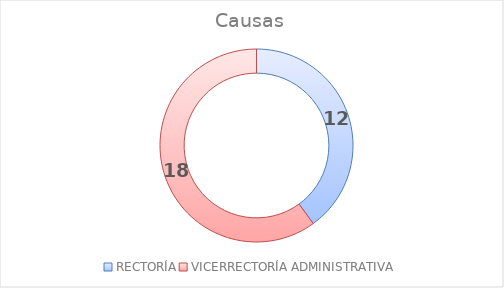
| Category | Causas |
|---|---|
| RECTORÍA | 12 |
| VICERRECTORÍA ADMINISTRATIVA | 18 |